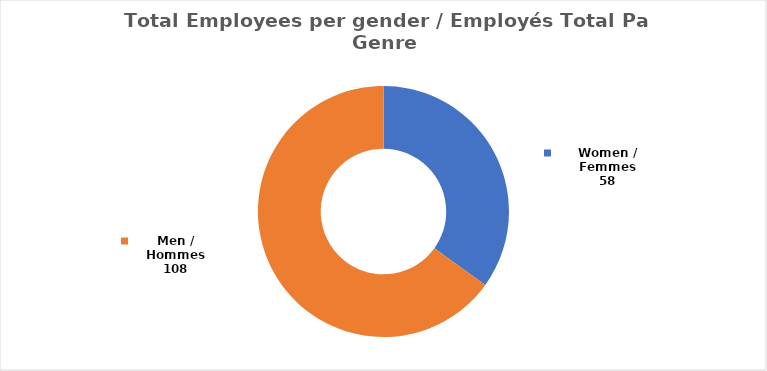
| Category | Series 0 |
|---|---|
| Women / Femmes | 58 |
| Men / Hommes | 108 |